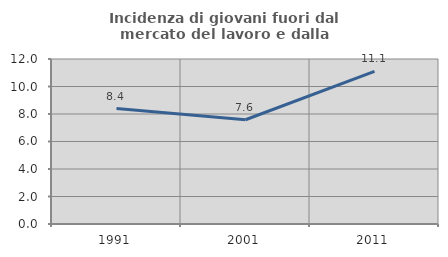
| Category | Incidenza di giovani fuori dal mercato del lavoro e dalla formazione  |
|---|---|
| 1991.0 | 8.397 |
| 2001.0 | 7.583 |
| 2011.0 | 11.104 |